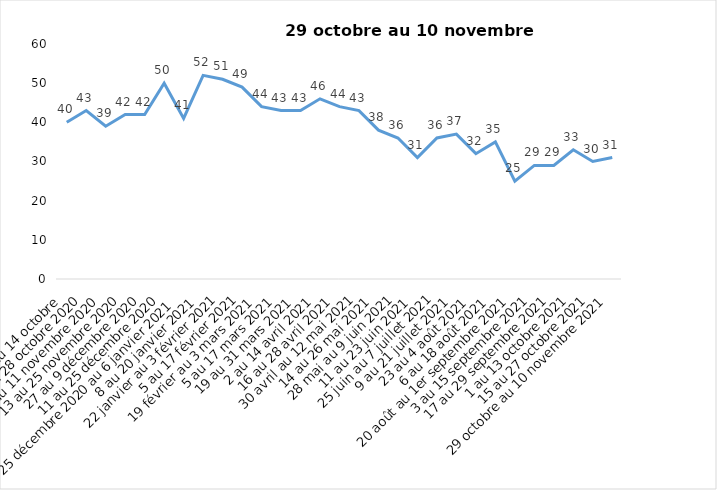
| Category | Toujours aux trois mesures |
|---|---|
| 2 au 14 octobre  | 40 |
| 16 au 28 octobre 2020 | 43 |
| 30 octobre au 11 novembre 2020 | 39 |
| 13 au 25 novembre 2020 | 42 |
| 27 au 9 décembre 2020 | 42 |
| 11 au 25 décembre 2020 | 50 |
| 25 décembre 2020 au 6 janvier 2021 | 41 |
| 8 au 20 janvier 2021 | 52 |
| 22 janvier au 3 février 2021 | 51 |
| 5 au 17 février 2021 | 49 |
| 19 février au 3 mars 2021 | 44 |
| 5 au 17 mars 2021 | 43 |
| 19 au 31 mars 2021 | 43 |
| 2 au 14 avril 2021 | 46 |
| 16 au 28 avril 2021 | 44 |
| 30 avril au 12 mai 2021 | 43 |
| 14 au 26 mai 2021 | 38 |
| 28 mai au 9 juin 2021 | 36 |
| 11 au 23 juin 2021 | 31 |
| 25 juin au 7 juillet 2021 | 36 |
| 9 au 21 juillet 2021 | 37 |
| 23 au 4 août 2021 | 32 |
| 6 au 18 août 2021 | 35 |
| 20 août au 1er septembre 2021 | 25 |
| 3 au 15 septembre 2021 | 29 |
| 17 au 29 septembre 2021 | 29 |
| 1 au 13 octobre 2021 | 33 |
| 15 au 27 octobre 2021 | 30 |
| 29 octobre au 10 novembre 2021 | 31 |